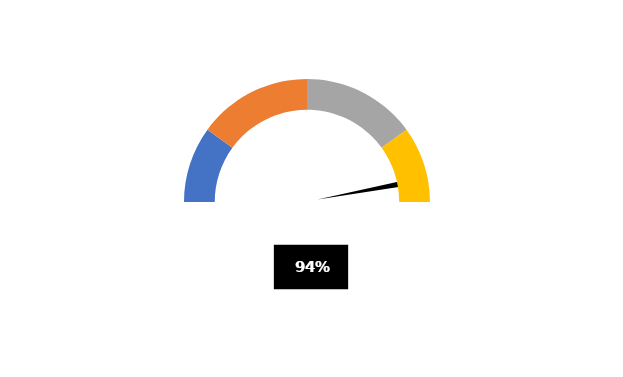
| Category | PUNTERO |
|---|---|
| 0 | 0.465 |
| 1 | 0.01 |
| 2 | 0.525 |